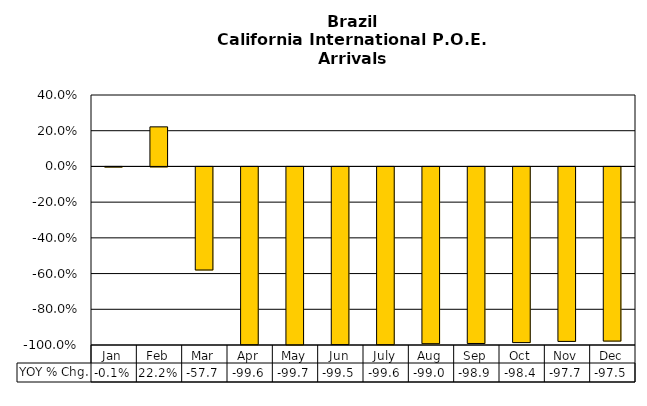
| Category | YOY % Chg. |
|---|---|
| Jan | -0.001 |
| Feb | 0.222 |
| Mar | -0.577 |
| Apr | -0.996 |
| May | -0.997 |
| Jun | -0.995 |
| July | -0.996 |
| Aug | -0.99 |
| Sep | -0.989 |
| Oct | -0.984 |
| Nov | -0.977 |
| Dec | -0.975 |